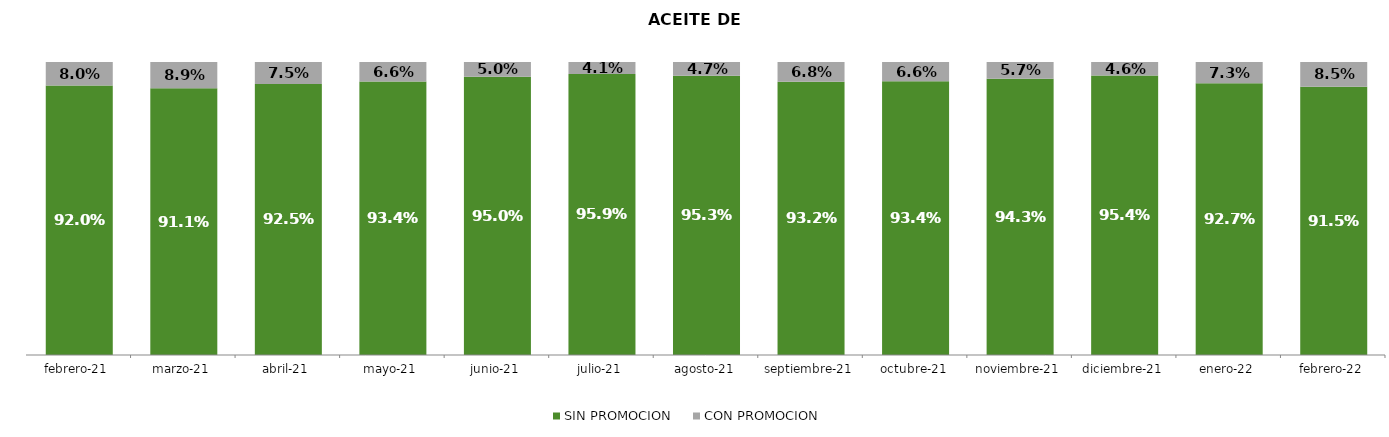
| Category | SIN PROMOCION   | CON PROMOCION   |
|---|---|---|
| 2021-02-01 | 0.92 | 0.08 |
| 2021-03-01 | 0.911 | 0.089 |
| 2021-04-01 | 0.925 | 0.075 |
| 2021-05-01 | 0.934 | 0.066 |
| 2021-06-01 | 0.95 | 0.05 |
| 2021-07-01 | 0.959 | 0.041 |
| 2021-08-01 | 0.953 | 0.047 |
| 2021-09-01 | 0.932 | 0.068 |
| 2021-10-01 | 0.934 | 0.066 |
| 2021-11-01 | 0.943 | 0.057 |
| 2021-12-01 | 0.954 | 0.046 |
| 2022-01-01 | 0.927 | 0.073 |
| 2022-02-01 | 0.915 | 0.085 |